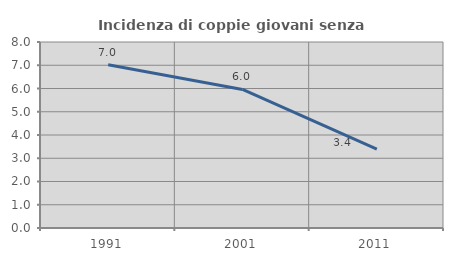
| Category | Incidenza di coppie giovani senza figli |
|---|---|
| 1991.0 | 7.024 |
| 2001.0 | 5.961 |
| 2011.0 | 3.391 |